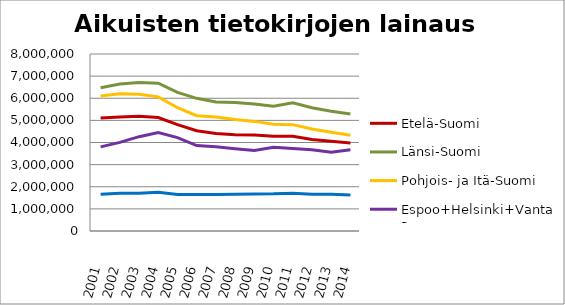
| Category | Etelä-Suomi | Länsi-Suomi | Pohjois- ja Itä-Suomi | Espoo+Helsinki+Vantaa | Muu Uusimaa |
|---|---|---|---|---|---|
| 2001.0 | 5112174 | 6475031 | 6105245 | 3803024 | 1658426 |
| 2002.0 | 5152719 | 6640207 | 6203632 | 4005568 | 1701792 |
| 2003.0 | 5180877 | 6709642 | 6183342 | 4263014 | 1711401 |
| 2004.0 | 5127601 | 6677490 | 6063331 | 4447882 | 1756211 |
| 2005.0 | 4805065 | 6264267 | 5572477 | 4222842 | 1647779 |
| 2006.0 | 4530491 | 5995653 | 5211168 | 3863024 | 1647921 |
| 2007.0 | 4407278 | 5833883 | 5149637 | 3812334 | 1653010 |
| 2008.0 | 4351086 | 5802498 | 5036009 | 3720345 | 1659044 |
| 2009.0 | 4342105 | 5740652 | 4954155 | 3636873 | 1677493 |
| 2010.0 | 4284363 | 5639735 | 4829887 | 3787241 | 1678410 |
| 2011.0 | 4276962 | 5793552 | 4807631 | 3731410 | 1701657 |
| 2012.0 | 4132862 | 5573728 | 4608519 | 3670892 | 1660320 |
| 2013.0 | 4061738 | 5411346 | 4459448 | 3554522 | 1655807 |
| 2014.0 | 3979851 | 5289592 | 4323592 | 3673338 | 1626903 |